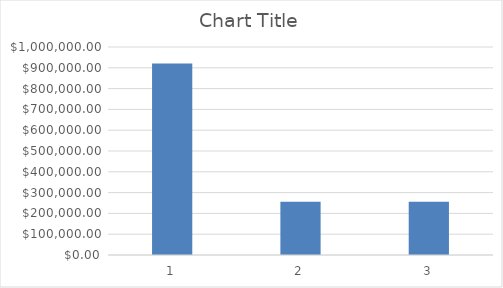
| Category | Series 0 |
|---|---|
| 0 | 920256.312 |
| 1 | 256523.416 |
| 2 | 256523.416 |